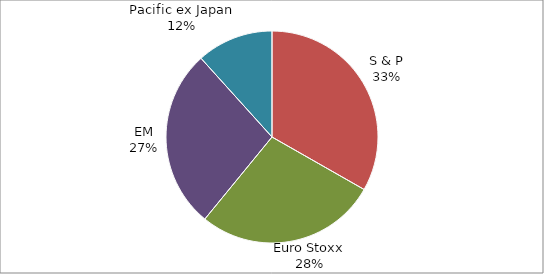
| Category | Series 0 |
|---|---|
| S & P | 0.332 |
| Euro Stoxx | 0.277 |
| EM | 0.274 |
| Pacific ex Japan | 0.117 |